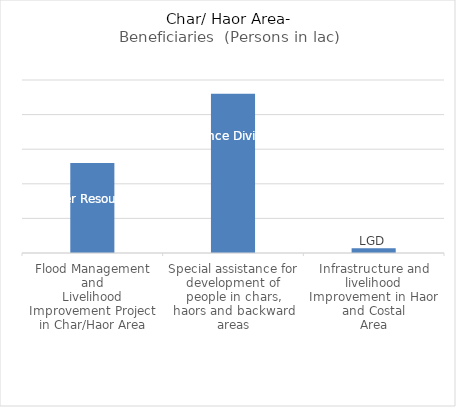
| Category | Beneficiaries  (Persons in lac) |
|---|---|
| Flood Management and
Livelihood Improvement Project in Char/Haor Area | 0.13 |
| Special assistance for development of people in chars,
haors and backward areas | 0.23 |
| Infrastructure and livelihood Improvement in Haor and Costal
Area | 0.007 |